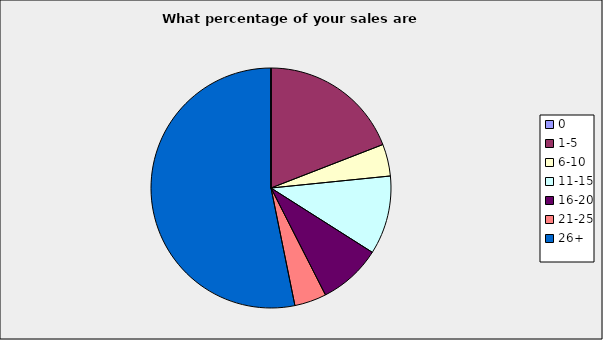
| Category | Series 0 |
|---|---|
| 0 | 0 |
| 1-5 | 0.191 |
| 6-10 | 0.043 |
| 11-15 | 0.106 |
| 16-20 | 0.085 |
| 21-25 | 0.043 |
| 26+ | 0.532 |